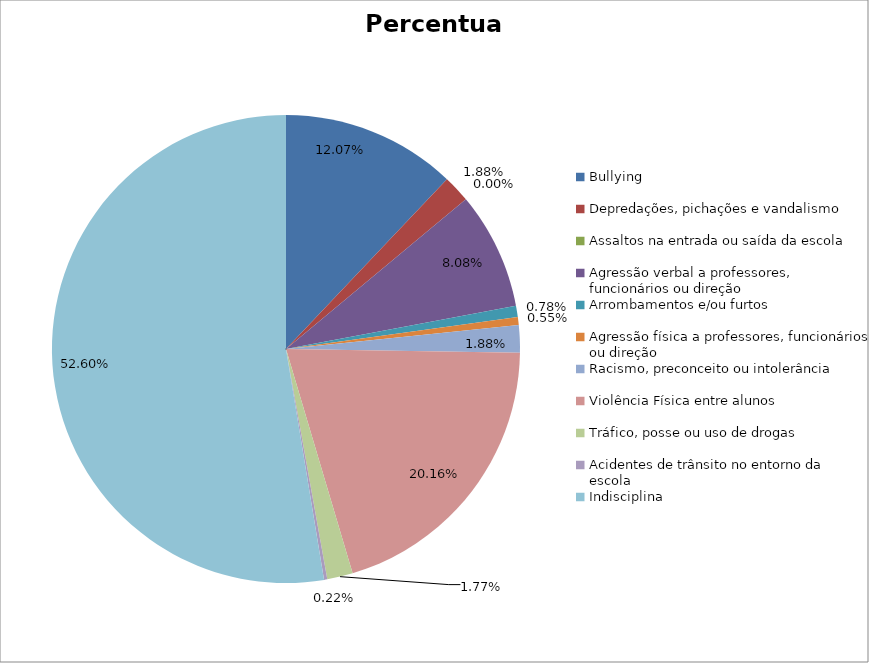
| Category | Percentual |
|---|---|
| Bullying | 0.121 |
| Depredações, pichações e vandalismo | 0.019 |
| Assaltos na entrada ou saída da escola | 0 |
| Agressão verbal a professores, funcionários ou direção | 0.081 |
| Arrombamentos e/ou furtos | 0.008 |
| Agressão física a professores, funcionários ou direção | 0.006 |
| Racismo, preconceito ou intolerância | 0.019 |
| Violência Física entre alunos | 0.202 |
| Tráfico, posse ou uso de drogas | 0.018 |
| Acidentes de trânsito no entorno da escola | 0.002 |
| Indisciplina | 0.526 |